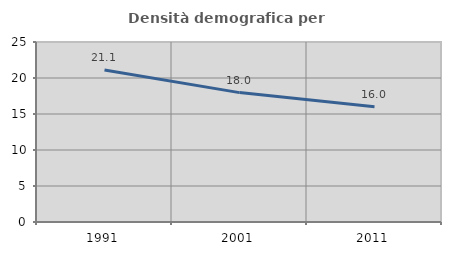
| Category | Densità demografica |
|---|---|
| 1991.0 | 21.11 |
| 2001.0 | 17.971 |
| 2011.0 | 16.019 |